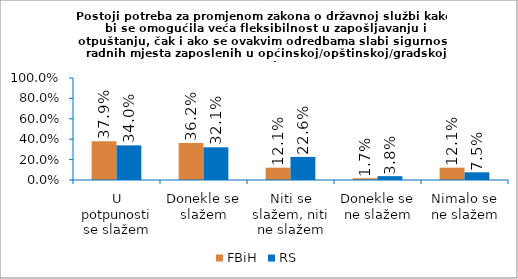
| Category | FBiH | RS |
|---|---|---|
| U potpunosti se slažem | 0.379 | 0.34 |
| Donekle se slažem | 0.362 | 0.321 |
| Niti se slažem, niti ne slažem | 0.121 | 0.226 |
| Donekle se ne slažem | 0.017 | 0.038 |
| Nimalo se ne slažem | 0.121 | 0.075 |